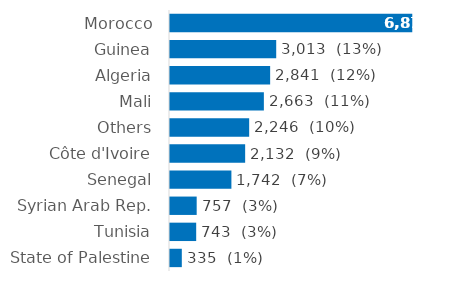
| Category | Series 0 |
|---|---|
| Morocco | 6873 |
| Guinea | 3013 |
| Algeria | 2841 |
| Mali | 2663 |
| Others | 2246 |
| Côte d'Ivoire | 2132 |
| Senegal | 1742 |
| Syrian Arab Rep. | 757 |
| Tunisia | 743 |
| State of Palestine | 335 |